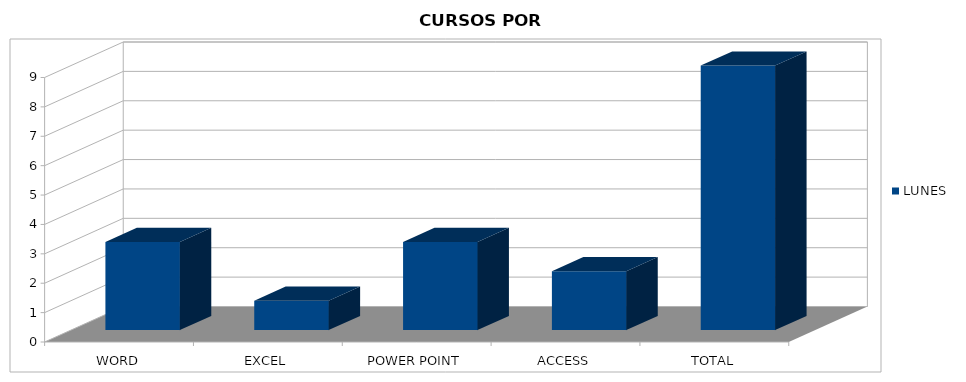
| Category | LUNES |
|---|---|
| WORD | 3 |
| EXCEL | 1 |
| POWER POINT | 3 |
| ACCESS | 2 |
| TOTAL | 9 |